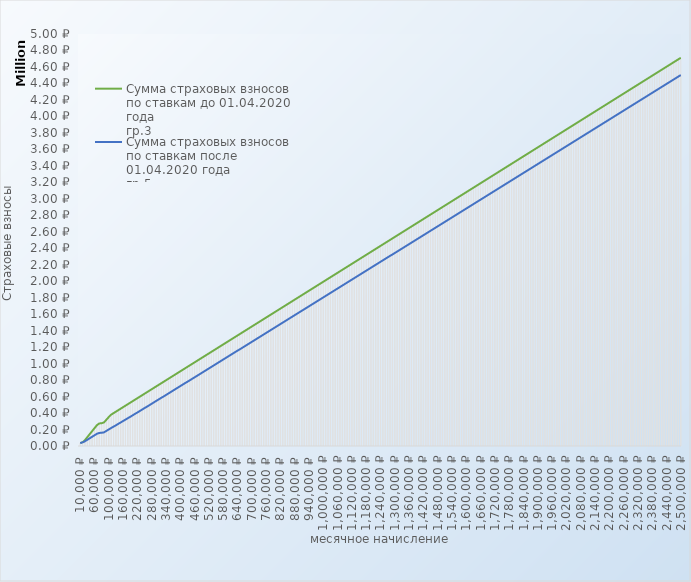
| Category | Сумма страховых взносов по ставкам до 01.04.2020 года
гр.3 | Сумма страховых взносов по ставкам после 01.04.2020 года
гр.5 |
|---|---|---|
| 10000.0 | 36000 | 36000 |
| 12130.0 | 43668 | 43668 |
| 20000.0 | 72000 | 57834 |
| 30000.0 | 108000 | 75834 |
| 40000.0 | 144000 | 93834 |
| 50000.0 | 180000 | 111834 |
| 60000.0 | 216000 | 129834 |
| 70000.0 | 252000 | 147834 |
| 76000.0 | 273600 | 158634 |
| 77000.0 | 276852 | 160434 |
| 80000.0 | 286608 | 165834 |
| 90000.0 | 319128 | 183478.46 |
| 100000.0 | 351648 | 201126.69 |
| 110000.0 | 380808 | 218778.69 |
| 120000.0 | 398928 | 234971.32 |
| 130000.0 | 417048 | 251221.95 |
| 140000.0 | 435168 | 269163.95 |
| 150000.0 | 453288 | 285704.58 |
| 160000.0 | 471408 | 303340.98 |
| 170000.0 | 489528 | 319900.98 |
| 180000.0 | 507648 | 337897.21 |
| 190000.0 | 525768 | 354093.61 |
| 200000.0 | 543888 | 372093.61 |
| 210000.0 | 562008 | 390093.61 |
| 220000.0 | 580128 | 406638.01 |
| 230000.0 | 598248 | 424286.24 |
| 240000.0 | 616368 | 442286.24 |
| 250000.0 | 634488 | 460286.24 |
| 260000.0 | 652608 | 476830.64 |
| 270000.0 | 670728 | 494830.64 |
| 280000.0 | 688848 | 512830.64 |
| 290000.0 | 706968 | 530830.64 |
| 300000.0 | 725088 | 548826.87 |
| 310000.0 | 743208 | 566478.87 |
| 320000.0 | 761328 | 584463.27 |
| 330000.0 | 779448 | 601023.27 |
| 340000.0 | 797568 | 619023.27 |
| 350000.0 | 815688 | 637023.27 |
| 360000.0 | 833808 | 655023.27 |
| 370000.0 | 851928 | 673023.27 |
| 380000.0 | 870048 | 691023.27 |
| 390000.0 | 888168 | 709023.27 |
| 400000.0 | 906288 | 727023.27 |
| 410000.0 | 924408 | 745023.27 |
| 420000.0 | 942528 | 763023.27 |
| 430000.0 | 960648 | 779807.67 |
| 440000.0 | 978768 | 797567.67 |
| 450000.0 | 996888 | 815563.9 |
| 460000.0 | 1015008 | 833215.9 |
| 470000.0 | 1033128 | 851215.9 |
| 480000.0 | 1051248 | 869215.9 |
| 490000.0 | 1069368 | 887215.9 |
| 500000.0 | 1087488 | 905215.9 |
| 510000.0 | 1105608 | 923215.9 |
| 520000.0 | 1123728 | 941215.9 |
| 530000.0 | 1141848 | 959215.9 |
| 540000.0 | 1159968 | 977215.9 |
| 550000.0 | 1178088 | 995215.9 |
| 560000.0 | 1196208 | 1013215.9 |
| 570000.0 | 1214328 | 1031215.9 |
| 580000.0 | 1232448 | 1049215.9 |
| 590000.0 | 1250568 | 1067215.9 |
| 600000.0 | 1268688 | 1085215.9 |
| 610000.0 | 1286808 | 1103215.9 |
| 620000.0 | 1304928 | 1121215.9 |
| 630000.0 | 1323048 | 1139215.9 |
| 640000.0 | 1341168 | 1157200.3 |
| 650000.0 | 1359288 | 1173760.3 |
| 660000.0 | 1377408 | 1191760.3 |
| 670000.0 | 1395528 | 1209760.3 |
| 680000.0 | 1413648 | 1227760.3 |
| 690000.0 | 1431768 | 1245760.3 |
| 700000.0 | 1449888 | 1263760.3 |
| 710000.0 | 1468008 | 1281760.3 |
| 720000.0 | 1486128 | 1299760.3 |
| 730000.0 | 1504248 | 1317760.3 |
| 740000.0 | 1522368 | 1335760.3 |
| 750000.0 | 1540488 | 1353760.3 |
| 760000.0 | 1558608 | 1371760.3 |
| 770000.0 | 1576728 | 1389760.3 |
| 780000.0 | 1594848 | 1407760.3 |
| 790000.0 | 1612968 | 1425760.3 |
| 800000.0 | 1631088 | 1443760.3 |
| 810000.0 | 1649208 | 1461760.3 |
| 820000.0 | 1667328 | 1479760.3 |
| 830000.0 | 1685448 | 1497760.3 |
| 840000.0 | 1703568 | 1515760.3 |
| 850000.0 | 1721688 | 1533760.3 |
| 860000.0 | 1739808 | 1551760.3 |
| 870000.0 | 1757928 | 1569760.3 |
| 880000.0 | 1776048 | 1587760.3 |
| 890000.0 | 1794168 | 1605760.3 |
| 900000.0 | 1812288 | 1623756.53 |
| 910000.0 | 1830408 | 1641466.53 |
| 920000.0 | 1848528 | 1659408.53 |
| 930000.0 | 1866648 | 1677408.53 |
| 940000.0 | 1884768 | 1695408.53 |
| 950000.0 | 1902888 | 1713408.53 |
| 960000.0 | 1921008 | 1731408.53 |
| 970000.0 | 1939128 | 1749408.53 |
| 980000.0 | 1957248 | 1767408.53 |
| 990000.0 | 1975368 | 1785408.53 |
| 1000000.0 | 1993488 | 1803408.53 |
| 1010000.0 | 2011608 | 1821408.53 |
| 1020000.0 | 2029728 | 1839408.53 |
| 1030000.0 | 2047848 | 1857408.53 |
| 1040000.0 | 2065968 | 1875408.53 |
| 1050000.0 | 2084088 | 1893408.53 |
| 1060000.0 | 2102208 | 1911408.53 |
| 1070000.0 | 2120328 | 1929408.53 |
| 1080000.0 | 2138448 | 1947408.53 |
| 1090000.0 | 2156568 | 1965408.53 |
| 1100000.0 | 2174688 | 1983408.53 |
| 1110000.0 | 2192808 | 2001408.53 |
| 1120000.0 | 2210928 | 2019408.53 |
| 1130000.0 | 2229048 | 2037408.53 |
| 1140000.0 | 2247168 | 2055408.53 |
| 1150000.0 | 2265288 | 2073408.53 |
| 1160000.0 | 2283408 | 2091408.53 |
| 1170000.0 | 2301528 | 2109408.53 |
| 1180000.0 | 2319648 | 2127408.53 |
| 1190000.0 | 2337768 | 2145408.53 |
| 1200000.0 | 2355888 | 2163408.53 |
| 1210000.0 | 2374008 | 2181408.53 |
| 1220000.0 | 2392128 | 2199408.53 |
| 1230000.0 | 2410248 | 2217408.53 |
| 1240000.0 | 2428368 | 2235408.53 |
| 1250000.0 | 2446488 | 2253408.53 |
| 1260000.0 | 2464608 | 2271408.53 |
| 1270000.0 | 2482728 | 2289408.53 |
| 1280000.0 | 2500848 | 2307392.93 |
| 1290000.0 | 2518968 | 2324192.93 |
| 1300000.0 | 2537088 | 2341952.93 |
| 1310000.0 | 2555208 | 2359952.93 |
| 1320000.0 | 2573328 | 2377952.93 |
| 1330000.0 | 2591448 | 2395952.93 |
| 1340000.0 | 2609568 | 2413952.93 |
| 1350000.0 | 2627688 | 2431952.93 |
| 1360000.0 | 2645808 | 2449952.93 |
| 1370000.0 | 2663928 | 2467952.93 |
| 1380000.0 | 2682048 | 2485952.93 |
| 1390000.0 | 2700168 | 2503952.93 |
| 1400000.0 | 2718288 | 2521952.93 |
| 1410000.0 | 2736408 | 2539952.93 |
| 1420000.0 | 2754528 | 2557952.93 |
| 1430000.0 | 2772648 | 2575952.93 |
| 1440000.0 | 2790768 | 2593952.93 |
| 1450000.0 | 2808888 | 2611952.93 |
| 1460000.0 | 2827008 | 2629952.93 |
| 1470000.0 | 2845128 | 2647952.93 |
| 1480000.0 | 2863248 | 2665952.93 |
| 1490000.0 | 2881368 | 2683952.93 |
| 1500000.0 | 2899488 | 2701952.93 |
| 1510000.0 | 2917608 | 2719952.93 |
| 1520000.0 | 2935728 | 2737952.93 |
| 1530000.0 | 2953848 | 2755952.93 |
| 1540000.0 | 2971968 | 2773952.93 |
| 1550000.0 | 2990088 | 2791952.93 |
| 1560000.0 | 3008208 | 2809952.93 |
| 1570000.0 | 3026328 | 2827952.93 |
| 1580000.0 | 3044448 | 2845952.93 |
| 1590000.0 | 3062568 | 2863952.93 |
| 1600000.0 | 3080688 | 2881952.93 |
| 1610000.0 | 3098808 | 2899952.93 |
| 1620000.0 | 3116928 | 2917952.93 |
| 1630000.0 | 3135048 | 2935952.93 |
| 1640000.0 | 3153168 | 2953952.93 |
| 1650000.0 | 3171288 | 2971952.93 |
| 1660000.0 | 3189408 | 2989952.93 |
| 1670000.0 | 3207528 | 3007952.93 |
| 1680000.0 | 3225648 | 3025952.93 |
| 1690000.0 | 3243768 | 3043952.93 |
| 1700000.0 | 3261888 | 3061952.93 |
| 1710000.0 | 3280008 | 3079952.93 |
| 1720000.0 | 3298128 | 3097952.93 |
| 1730000.0 | 3316248 | 3115952.93 |
| 1740000.0 | 3334368 | 3133952.93 |
| 1750000.0 | 3352488 | 3151952.93 |
| 1760000.0 | 3370608 | 3169952.93 |
| 1770000.0 | 3388728 | 3187952.93 |
| 1780000.0 | 3406848 | 3205952.93 |
| 1790000.0 | 3424968 | 3223952.93 |
| 1800000.0 | 3443088 | 3241952.93 |
| 1810000.0 | 3461208 | 3259952.93 |
| 1820000.0 | 3479328 | 3277952.93 |
| 1830000.0 | 3497448 | 3295952.93 |
| 1840000.0 | 3515568 | 3313952.93 |
| 1850000.0 | 3533688 | 3331952.93 |
| 1860000.0 | 3551808 | 3349952.93 |
| 1870000.0 | 3569928 | 3367952.93 |
| 1880000.0 | 3588048 | 3385952.93 |
| 1890000.0 | 3606168 | 3403952.93 |
| 1900000.0 | 3624288 | 3421952.93 |
| 1910000.0 | 3642408 | 3439952.93 |
| 1920000.0 | 3660528 | 3457952.93 |
| 1930000.0 | 3678648 | 3475952.93 |
| 1940000.0 | 3696768 | 3493952.93 |
| 1950000.0 | 3714888 | 3511952.93 |
| 1960000.0 | 3733008 | 3529952.93 |
| 1970000.0 | 3751128 | 3547952.93 |
| 1980000.0 | 3769248 | 3565952.93 |
| 1990000.0 | 3787368 | 3583952.93 |
| 2000000.0 | 3805488 | 3601952.93 |
| 2010000.0 | 3823608 | 3619952.93 |
| 2020000.0 | 3841728 | 3637952.93 |
| 2030000.0 | 3859848 | 3655952.93 |
| 2040000.0 | 3877968 | 3673952.93 |
| 2050000.0 | 3896088 | 3691952.93 |
| 2060000.0 | 3914208 | 3709952.93 |
| 2070000.0 | 3932328 | 3727952.93 |
| 2080000.0 | 3950448 | 3745952.93 |
| 2090000.0 | 3968568 | 3763952.93 |
| 2100000.0 | 3986688 | 3781952.93 |
| 2110000.0 | 4004808 | 3799952.93 |
| 2120000.0 | 4022928 | 3817952.93 |
| 2130000.0 | 4041048 | 3835952.93 |
| 2140000.0 | 4059168 | 3853952.93 |
| 2150000.0 | 4077288 | 3871952.93 |
| 2160000.0 | 4095408 | 3889952.93 |
| 2170000.0 | 4113528 | 3907952.93 |
| 2180000.0 | 4131648 | 3925952.93 |
| 2190000.0 | 4149768 | 3943952.93 |
| 2200000.0 | 4167888 | 3961952.93 |
| 2210000.0 | 4186008 | 3979952.93 |
| 2220000.0 | 4204128 | 3997952.93 |
| 2230000.0 | 4222248 | 4015952.93 |
| 2240000.0 | 4240368 | 4033952.93 |
| 2250000.0 | 4258488 | 4051952.93 |
| 2260000.0 | 4276608 | 4069952.93 |
| 2270000.0 | 4294728 | 4087952.93 |
| 2280000.0 | 4312848 | 4105952.93 |
| 2290000.0 | 4330968 | 4123952.93 |
| 2300000.0 | 4349088 | 4141952.93 |
| 2310000.0 | 4367208 | 4159952.93 |
| 2320000.0 | 4385328 | 4177952.93 |
| 2330000.0 | 4403448 | 4195952.93 |
| 2340000.0 | 4421568 | 4213952.93 |
| 2350000.0 | 4439688 | 4231952.93 |
| 2360000.0 | 4457808 | 4249952.93 |
| 2370000.0 | 4475928 | 4267952.93 |
| 2380000.0 | 4494048 | 4285952.93 |
| 2390000.0 | 4512168 | 4303952.93 |
| 2400000.0 | 4530288 | 4321952.93 |
| 2410000.0 | 4548408 | 4339952.93 |
| 2420000.0 | 4566528 | 4357952.93 |
| 2430000.0 | 4584648 | 4375952.93 |
| 2440000.0 | 4602768 | 4393952.93 |
| 2450000.0 | 4620888 | 4411952.93 |
| 2460000.0 | 4639008 | 4429952.93 |
| 2470000.0 | 4657128 | 4447952.93 |
| 2480000.0 | 4675248 | 4465952.93 |
| 2490000.0 | 4693368 | 4483952.93 |
| 2500000.0 | 4711488 | 4501952.93 |